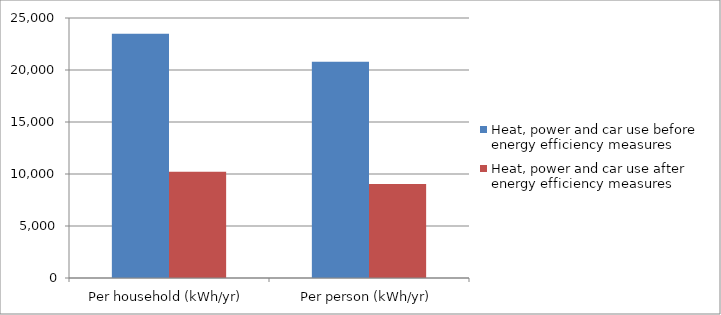
| Category | Heat, power and car use before energy efficiency measures | Heat, power and car use after energy efficiency measures |
|---|---|---|
| Per household (kWh/yr) | 23497.459 | 10216.286 |
| Per person (kWh/yr) | 20797.358 | 9042.33 |